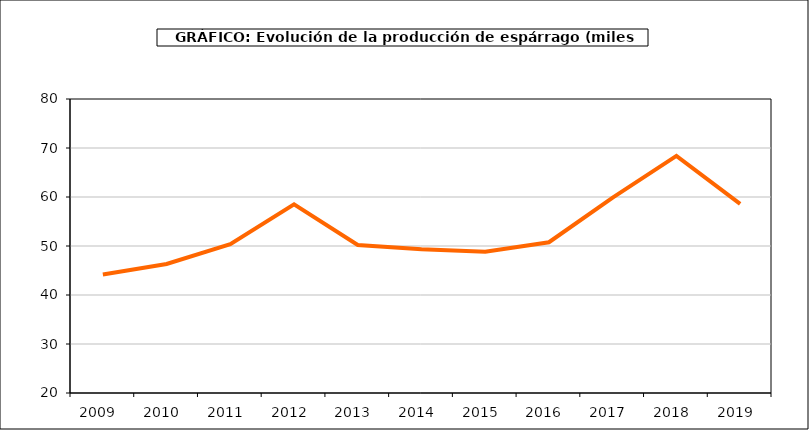
| Category | producción |
|---|---|
| 2009.0 | 44.169 |
| 2010.0 | 46.324 |
| 2011.0 | 50.362 |
| 2012.0 | 58.496 |
| 2013.0 | 50.212 |
| 2014.0 | 49.352 |
| 2015.0 | 48.814 |
| 2016.0 | 50.771 |
| 2017.0 | 59.869 |
| 2018.0 | 68.403 |
| 2019.0 | 58.605 |